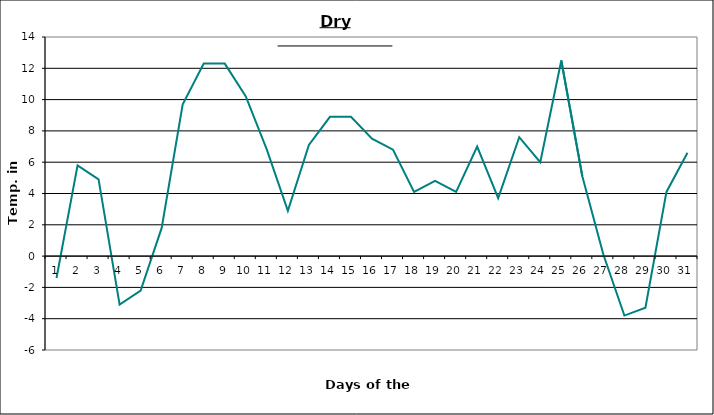
| Category | Series 0 |
|---|---|
| 0 | -1.4 |
| 1 | 5.8 |
| 2 | 4.9 |
| 3 | -3.1 |
| 4 | -2.2 |
| 5 | 1.8 |
| 6 | 9.7 |
| 7 | 12.3 |
| 8 | 12.3 |
| 9 | 10.2 |
| 10 | 6.8 |
| 11 | 2.9 |
| 12 | 7.1 |
| 13 | 8.9 |
| 14 | 8.9 |
| 15 | 7.5 |
| 16 | 6.8 |
| 17 | 4.1 |
| 18 | 4.8 |
| 19 | 4.1 |
| 20 | 7 |
| 21 | 3.7 |
| 22 | 7.6 |
| 23 | 6 |
| 24 | 12.5 |
| 25 | 5.1 |
| 26 | 0.1 |
| 27 | -3.8 |
| 28 | -3.3 |
| 29 | 4.1 |
| 30 | 6.6 |